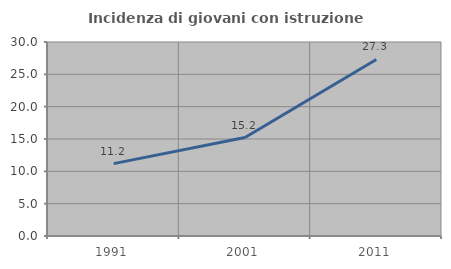
| Category | Incidenza di giovani con istruzione universitaria |
|---|---|
| 1991.0 | 11.196 |
| 2001.0 | 15.225 |
| 2011.0 | 27.296 |